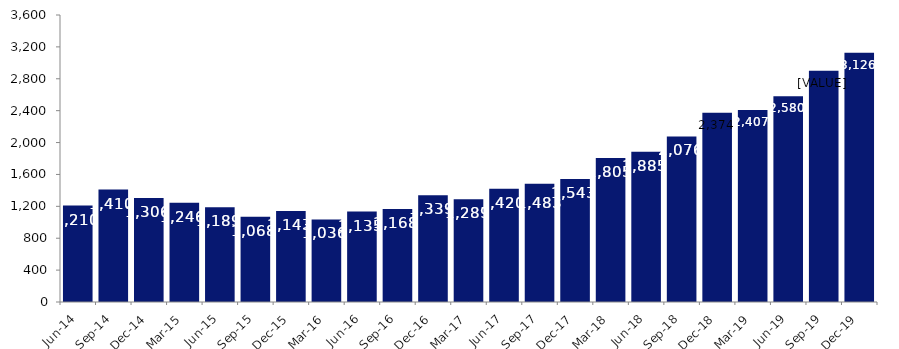
| Category | Series 0 |
|---|---|
| Jun-14 | 1210 |
| Sep-14 | 1410 |
| Dec-14 | 1306 |
| Mar-15 | 1246 |
| Jun-15 | 1189 |
| Sep-15 | 1068 |
| Dec-15 | 1143 |
| Mar-16 | 1036 |
| Jun-16 | 1135 |
| Sep-16 | 1168 |
| Dec-16 | 1339 |
| Mar-17 | 1289 |
| Jun-17 | 1420 |
| Sep-17 | 1483 |
| Dec-17 | 1543 |
| Mar-18 | 1805 |
| Jun-18 | 1885 |
| Sep-18 | 2076 |
| Dec-18 | 2374 |
| Mar-19 | 2407 |
| Jun-19 | 2580 |
| Sep-19 | 2901 |
| Dec-19 | 3126 |